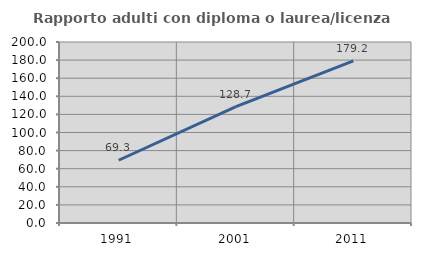
| Category | Rapporto adulti con diploma o laurea/licenza media  |
|---|---|
| 1991.0 | 69.341 |
| 2001.0 | 128.674 |
| 2011.0 | 179.181 |